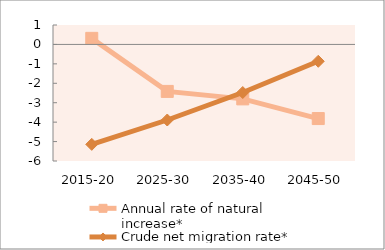
| Category | Annual rate of natural increase* | Crude net migration rate* |
|---|---|---|
| 2015-20 | 0.313 | -5.143 |
| 2025-30 | -2.418 | -3.89 |
| 2035-40 | -2.803 | -2.475 |
| 2045-50 | -3.815 | -0.867 |